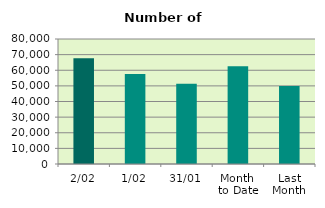
| Category | Series 0 |
|---|---|
| 2/02 | 67662 |
| 1/02 | 57566 |
| 31/01 | 51430 |
| Month 
to Date | 62614 |
| Last
Month | 49894.952 |